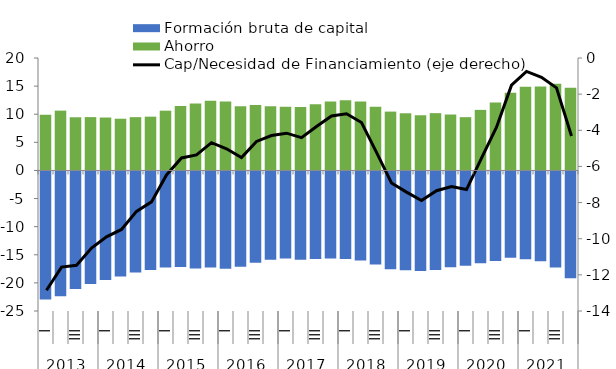
| Category | Formación bruta de capital | Ahorro |
|---|---|---|
| 0 | -22.761 | 9.907 |
| 1 | -22.21 | 10.64 |
| 2 | -20.923 | 9.457 |
| 3 | -20.005 | 9.485 |
| 4 | -19.307 | 9.413 |
| 5 | -18.688 | 9.201 |
| 6 | -17.968 | 9.48 |
| 7 | -17.53 | 9.568 |
| 8 | -17.104 | 10.63 |
| 9 | -16.977 | 11.447 |
| 10 | -17.257 | 11.898 |
| 11 | -17.081 | 12.394 |
| 12 | -17.299 | 12.277 |
| 13 | -16.932 | 11.426 |
| 14 | -16.254 | 11.637 |
| 15 | -15.727 | 11.439 |
| 16 | -15.47 | 11.311 |
| 17 | -15.702 | 11.291 |
| 18 | -15.563 | 11.776 |
| 19 | -15.49 | 12.281 |
| 20 | -15.564 | 12.476 |
| 21 | -15.823 | 12.254 |
| 22 | -16.535 | 11.315 |
| 23 | -17.377 | 10.466 |
| 24 | -17.59 | 10.169 |
| 25 | -17.699 | 9.817 |
| 26 | -17.533 | 10.189 |
| 27 | -17.059 | 9.948 |
| 28 | -16.758 | 9.476 |
| 29 | -16.312 | 10.772 |
| 30 | -15.928 | 12.099 |
| 31 | -15.338 | 13.836 |
| 32 | -15.611 | 14.869 |
| 33 | -15.991 | 14.926 |
| 34 | -17.07 | 15.42 |
| 35 | -19.01 | 14.695 |